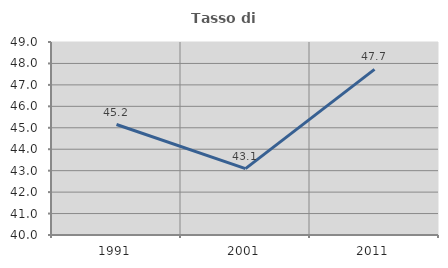
| Category | Tasso di occupazione   |
|---|---|
| 1991.0 | 45.151 |
| 2001.0 | 43.096 |
| 2011.0 | 47.721 |